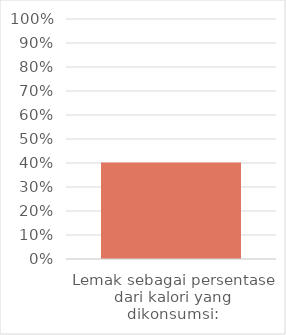
| Category | Series 0 |
|---|---|
| Lemak sebagai persentase dari kalori yang dikonsumsi: | 0.402 |